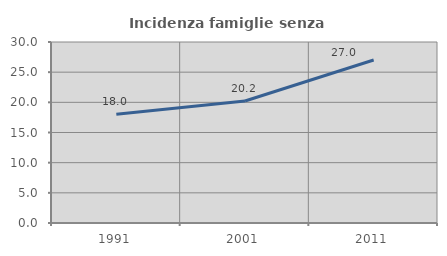
| Category | Incidenza famiglie senza nuclei |
|---|---|
| 1991.0 | 18.043 |
| 2001.0 | 20.225 |
| 2011.0 | 27.02 |